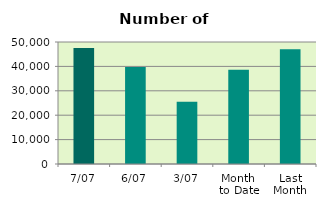
| Category | Series 0 |
|---|---|
| 7/07 | 47514 |
| 6/07 | 39792 |
| 3/07 | 25526 |
| Month 
to Date | 38636.4 |
| Last
Month | 46980.273 |